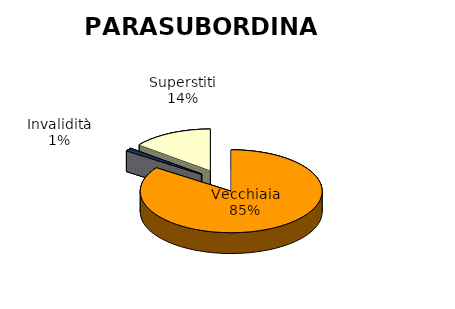
| Category | Parasubordinati |
|---|---|
| Vecchiaia | 28961 |
| Anz.tà/ Anticipate | 0 |
| Invalidità | 377 |
| Superstiti | 4895 |